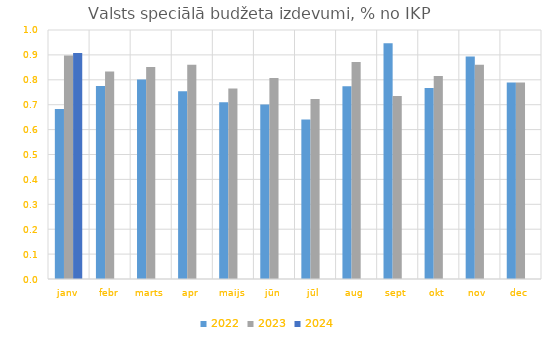
| Category | 2022 | 2023 | 2024 |
|---|---|---|---|
| janv | 0.683 | 0.898 | 0.907 |
| febr | 0.775 | 0.833 | 0 |
| marts | 0.801 | 0.851 | 0 |
| apr | 0.754 | 0.86 | 0 |
| maijs | 0.71 | 0.765 | 0 |
| jūn | 0.701 | 0.807 | 0 |
| jūl | 0.64 | 0.723 | 0 |
| aug | 0.774 | 0.872 | 0 |
| sept | 0.947 | 0.735 | 0 |
| okt | 0.767 | 0.815 | 0 |
| nov | 0.894 | 0.86 | 0 |
| dec | 0.79 | 0.79 | 0 |